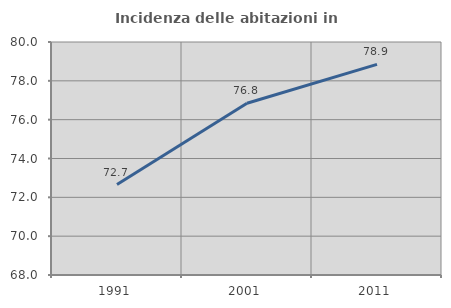
| Category | Incidenza delle abitazioni in proprietà  |
|---|---|
| 1991.0 | 72.657 |
| 2001.0 | 76.848 |
| 2011.0 | 78.85 |